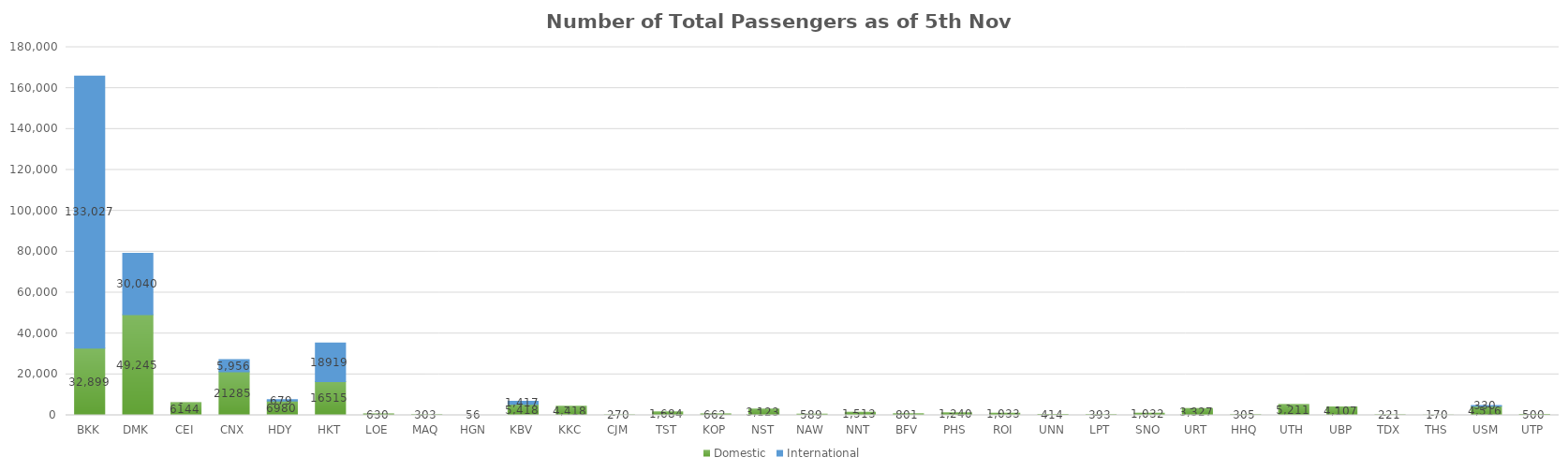
| Category | Domestic | International |
|---|---|---|
| BKK | 32899 | 133027 |
| DMK | 49245 | 30040 |
| CEI | 6144 | 0 |
| CNX | 21285 | 5956 |
| HDY | 6980 | 679 |
| HKT | 16515 | 18919 |
| LOE | 630 | 0 |
| MAQ | 303 | 0 |
| HGN | 56 | 0 |
| KBV | 5418 | 1417 |
| KKC | 4418 | 0 |
| CJM | 270 | 0 |
| TST | 1684 | 0 |
| KOP | 662 | 0 |
| NST | 3123 | 0 |
| NAW | 589 | 0 |
| NNT | 1513 | 0 |
| BFV | 801 | 0 |
| PHS | 1240 | 0 |
| ROI | 1033 | 0 |
| UNN | 414 | 0 |
| LPT | 393 | 0 |
| SNO | 1032 | 0 |
| URT | 3327 | 0 |
| HHQ | 305 | 0 |
| UTH | 5211 | 0 |
| UBP | 4107 | 0 |
| TDX | 221 | 0 |
| THS | 170 | 0 |
| USM | 4516 | 330 |
| UTP | 500 | 0 |